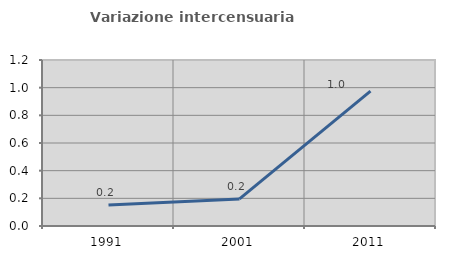
| Category | Variazione intercensuaria annua |
|---|---|
| 1991.0 | 0.152 |
| 2001.0 | 0.196 |
| 2011.0 | 0.975 |